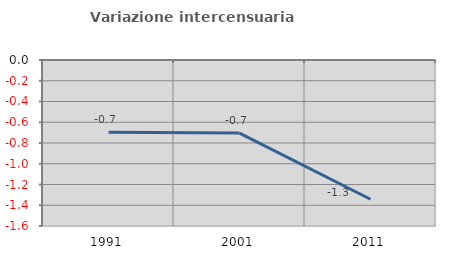
| Category | Variazione intercensuaria annua |
|---|---|
| 1991.0 | -0.696 |
| 2001.0 | -0.704 |
| 2011.0 | -1.342 |